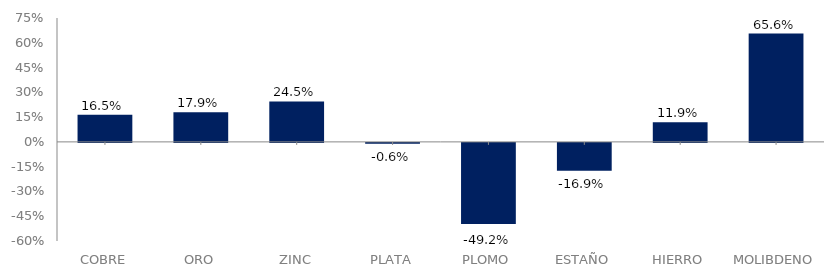
| Category | Series 0 |
|---|---|
| COBRE | 0.165 |
| ORO | 0.179 |
| ZINC | 0.245 |
| PLATA | -0.006 |
| PLOMO | -0.492 |
| ESTAÑO | -0.169 |
| HIERRO | 0.119 |
| MOLIBDENO | 0.656 |